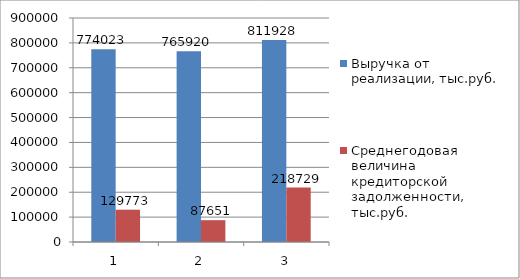
| Category | Выручка от реализации, тыс.руб. | Среднегодовая величина кредиторской задолженности, тыс.руб. |
|---|---|---|
| 0 | 774023 | 129773 |
| 1 | 765920 | 87651 |
| 2 | 811928 | 218729 |